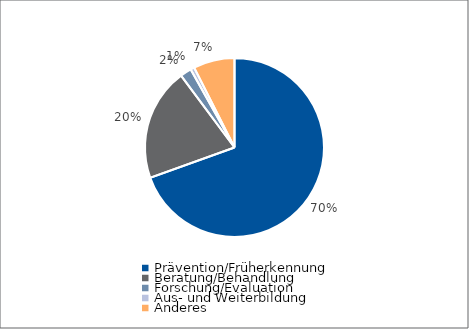
| Category | Series 0 |
|---|---|
| Prävention/Früherkennung | 141769.32 |
| Beratung/Behandlung | 41408.6 |
| Forschung/Evaluation | 4168.13 |
| Aus- und Weiterbildung | 1425.5 |
| Anderes | 15181.3 |